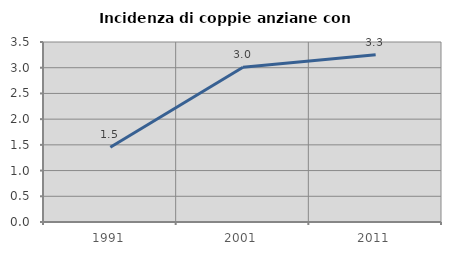
| Category | Incidenza di coppie anziane con figli |
|---|---|
| 1991.0 | 1.452 |
| 2001.0 | 3.01 |
| 2011.0 | 3.254 |